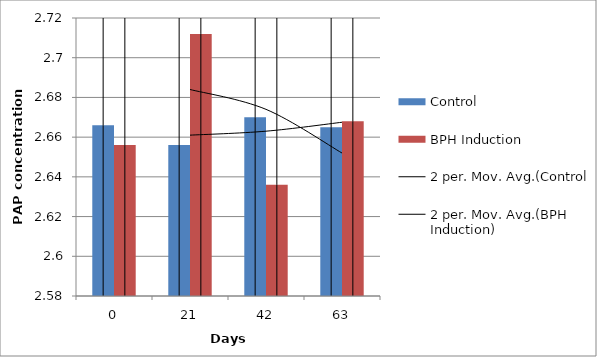
| Category | Control | BPH Induction |
|---|---|---|
| 0.0 | 2.666 | 2.656 |
| 21.0 | 2.656 | 2.712 |
| 42.0 | 2.67 | 2.636 |
| 63.0 | 2.665 | 2.668 |